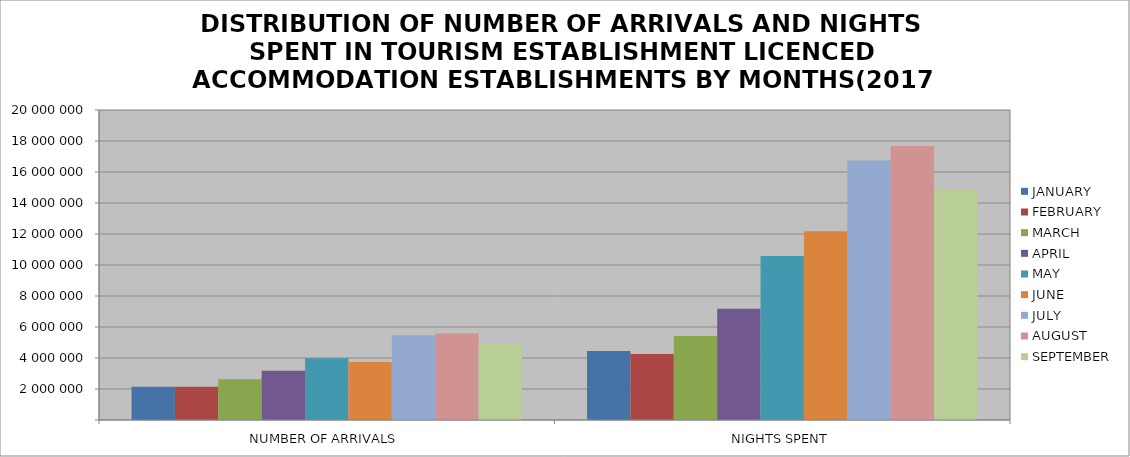
| Category | JANUARY | FEBRUARY | MARCH | APRIL | MAY | JUNE | JULY | AUGUST | SEPTEMBER |
|---|---|---|---|---|---|---|---|---|---|
| NUMBER OF ARRIVALS | 2146994 | 2141043 | 2629734 | 3173381 | 3978651 | 3742131 | 5470767 | 5580002 | 4908503 |
| NIGHTS SPENT | 4457352 | 4260377 | 5413903 | 7176325 | 10579158 | 12172370 | 16748728 | 17679357 | 14883465 |